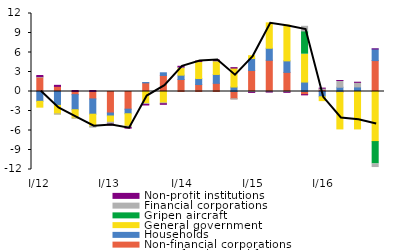
| Category | Non-financial corporations | Households | General government | Gripen aircraft | Financial corporations | Non-profit institutions |
|---|---|---|---|---|---|---|
| I/12 | 2.199 | -1.512 | -0.896 | 0 | 0.097 | 0.165 |
| II | 0.793 | -2.142 | -1.3 | 0 | -0.035 | 0.157 |
| III | -0.483 | -2.324 | -1.274 | 0 | -0.011 | 0.156 |
| IV | -1.145 | -2.347 | -1.874 | 0 | -0.12 | 0.155 |
| I/13 | -3.311 | -0.458 | -0.959 | 0 | -0.298 | -0.115 |
| II | -2.72 | -0.704 | -1.906 | 0 | -0.213 | -0.1 |
| III | 1.327 | 0.053 | -1.854 | 0 | -0.138 | -0.085 |
|  IV | 2.469 | 0.408 | -1.759 | 0 | -0.126 | -0.085 |
|  I/14 | 1.849 | 0.665 | 1.157 | 0 | 0.113 | 0.097 |
| II | 1.069 | 0.924 | 2.592 | 0 | 0.032 | 0.075 |
| III | 1.255 | 1.369 | 2.059 | 0 | 0.071 | 0.084 |
|  IV | -1.115 | 0.689 | 2.915 | 0 | -0.051 | 0.067 |
|  I/15 | 3.239 | 1.836 | 0.435 | 0 | -0.127 | -0.01 |
| II | 4.8 | 1.854 | 3.902 | 0 | -0.066 | -0.011 |
| III | 2.942 | 1.768 | 5.499 | 0 | -0.107 | -0.015 |
| IV | -0.485 | 1.454 | 4.284 | 3.576 | 0.717 | -0.021 |
|  I/16 | 0.308 | -0.81 | -0.595 | 0 | 0.2 | 0.002 |
| II | -0.126 | 0.655 | -5.631 | 0 | 1.033 | 0.001 |
| III | 0.015 | 0.687 | -5.759 | 0 | 0.713 | 0.004 |
| IV | 4.758 | 1.786 | -7.706 | -3.439 | -0.402 | 0.008 |